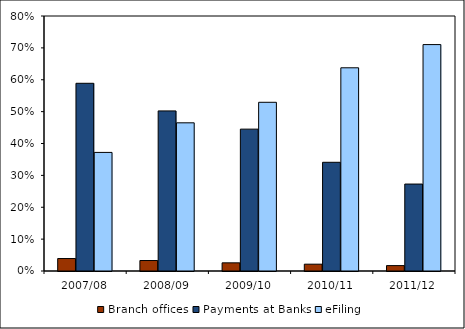
| Category | Branch offices | Payments at Banks | eFiling |
|---|---|---|---|
| 2007/08 | 0.039 | 0.589 | 0.372 |
| 2008/09 | 0.033 | 0.502 | 0.465 |
| 2009/10 | 0.026 | 0.445 | 0.529 |
| 2010/11 | 0.021 | 0.341 | 0.638 |
| 2011/12 | 0.017 | 0.273 | 0.71 |